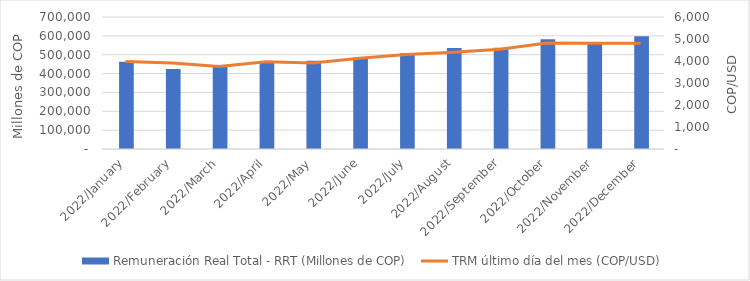
| Category | Remuneración Real Total - RRT (Millones de COP) |
|---|---|
| 44562.0 | 463020.337 |
| 44593.0 | 424025.205 |
| 44621.0 | 436621.239 |
| 44652.0 | 460485.854 |
| 44682.0 | 467453.061 |
| 44713.0 | 477541.004 |
| 44743.0 | 507475.641 |
| 44774.0 | 535853.049 |
| 44805.0 | 536984.945 |
| 44835.0 | 582270.009 |
| 44866.0 | 564546.953 |
| 44896.0 | 598225.963 |